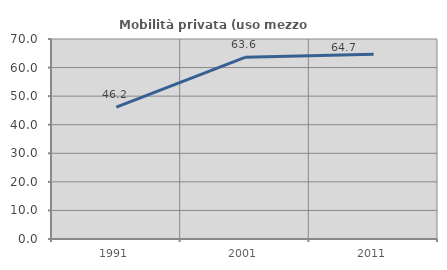
| Category | Mobilità privata (uso mezzo privato) |
|---|---|
| 1991.0 | 46.171 |
| 2001.0 | 63.595 |
| 2011.0 | 64.68 |